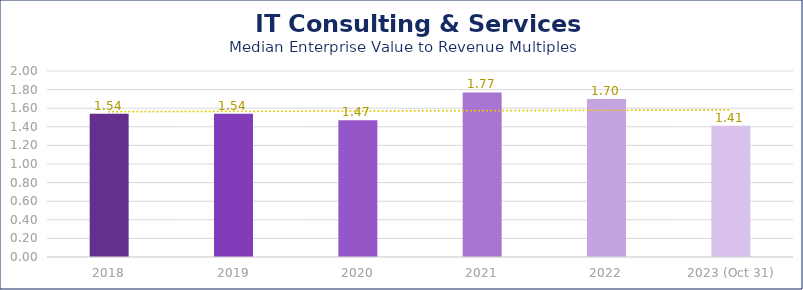
| Category | IT Consulting & Services |
|---|---|
| 2018 | 1.54 |
| 2019 | 1.54 |
| 2020 | 1.47 |
| 2021 | 1.77 |
| 2022 | 1.7 |
| 2023 (Oct 31) | 1.41 |